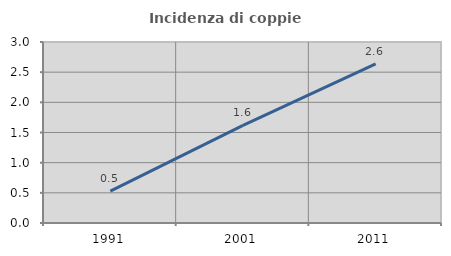
| Category | Incidenza di coppie miste |
|---|---|
| 1991.0 | 0.528 |
| 2001.0 | 1.62 |
| 2011.0 | 2.639 |